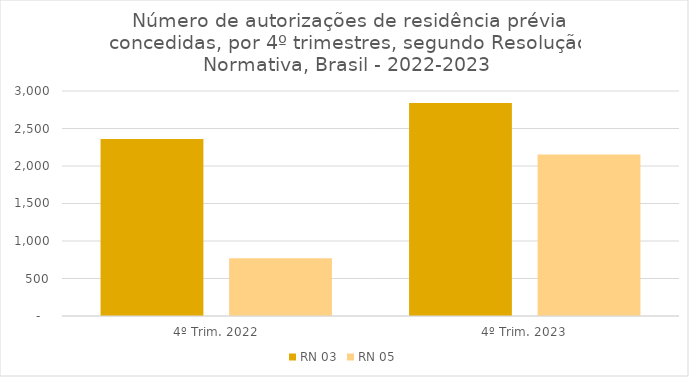
| Category | RN 03 | RN 05 |
|---|---|---|
| 4º Trim. 2022 | 2359 | 769 |
| 4º Trim. 2023 | 2840 | 2152 |